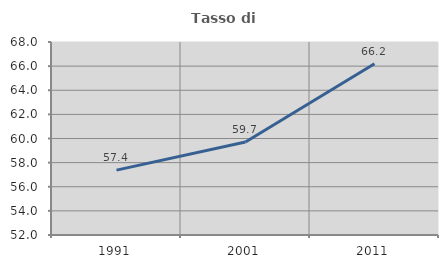
| Category | Tasso di occupazione   |
|---|---|
| 1991.0 | 57.378 |
| 2001.0 | 59.704 |
| 2011.0 | 66.192 |